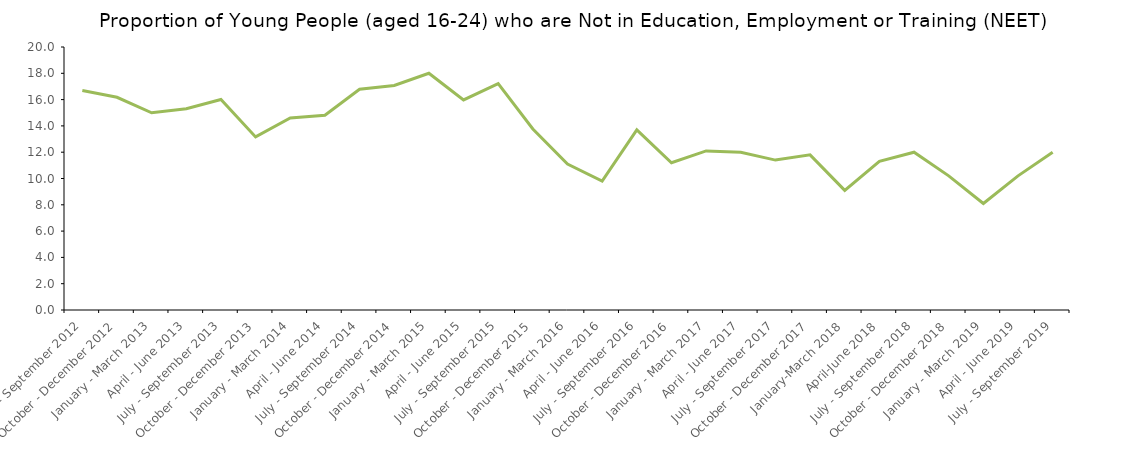
| Category | Series 2 |
|---|---|
| July - September 2012 | 16.69 |
| October - December 2012 | 16.178 |
| January - March 2013 | 15 |
| April - June 2013 | 15.3 |
| July - September 2013 | 16.006 |
| October - December 2013 | 13.163 |
| January - March 2014 | 14.6 |
| April - June 2014 | 14.811 |
| July - September 2014 | 16.785 |
| October - December 2014 | 17.073 |
| January - March 2015 | 18 |
| April - June 2015 | 15.972 |
| July - September 2015 | 17.216 |
| October - December 2015 | 13.765 |
| January - March 2016 | 11.1 |
| April - June 2016 | 9.8 |
| July - September 2016 | 13.7 |
| October - December 2016 | 11.2 |
| January - March 2017 | 12.1 |
| April - June 2017 | 12 |
| July - September 2017 | 11.4 |
| October - December 2017 | 11.8 |
| January-March 2018 | 9.1 |
| April-June 2018 | 11.3 |
| July - September 2018 | 12 |
| October - December 2018 | 10.2 |
| January - March 2019 | 8.1 |
| April - June 2019 | 10.2 |
| July - September 2019 | 12 |